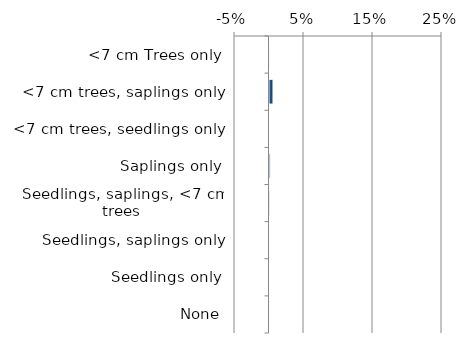
| Category | Near native & fragments |
|---|---|
| None | 0.001 |
| Seedlings only | 0 |
| Seedlings, saplings only | 0.001 |
| Seedlings, saplings, <7 cm trees | 0.002 |
| Saplings only | 0.002 |
| <7 cm trees, seedlings only | 0 |
| <7 cm trees, saplings only | 0.007 |
| <7 cm Trees only | 0.001 |